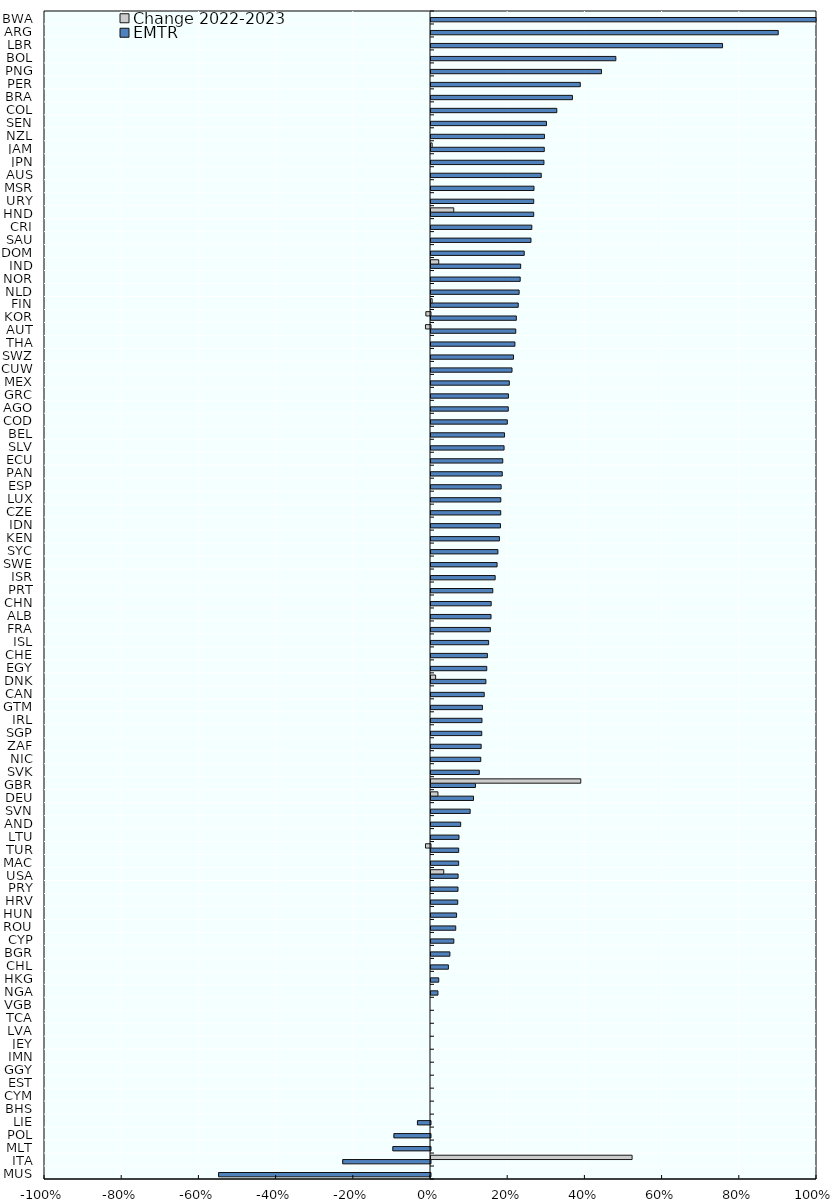
| Category | EMTR | Change 2022-2023 |
|---|---|---|
| MUS | -0.549 | 0 |
| ITA | -0.227 | 0.521 |
| MLT | -0.097 | 0 |
| POL | -0.095 | 0 |
| LIE | -0.034 | 0 |
| BHS | 0 | 0 |
| CYM | 0 | 0 |
| EST | 0 | 0 |
| GGY | 0 | 0 |
| IMN | 0 | 0 |
| JEY | 0 | 0 |
| LVA | 0 | 0 |
| TCA | 0 | 0 |
| VGB | 0 | 0 |
| NGA | 0.018 | 0 |
| HKG | 0.02 | 0 |
| CHL | 0.045 | 0 |
| BGR | 0.049 | 0 |
| CYP | 0.059 | 0 |
| ROU | 0.064 | 0 |
| HUN | 0.066 | 0 |
| HRV | 0.069 | 0 |
| PRY | 0.07 | 0 |
| USA | 0.07 | 0.033 |
| MAC | 0.072 | 0 |
| TUR | 0.072 | -0.013 |
| LTU | 0.073 | 0 |
| AND | 0.077 | 0 |
| SVN | 0.101 | 0 |
| DEU | 0.11 | 0.018 |
| GBR | 0.115 | 0.388 |
| SVK | 0.125 | 0 |
| NIC | 0.129 | 0 |
| ZAF | 0.13 | 0 |
| SGP | 0.131 | 0 |
| IRL | 0.132 | 0 |
| GTM | 0.133 | 0 |
| CAN | 0.138 | 0 |
| DNK | 0.142 | 0.012 |
| EGY | 0.144 | 0 |
| CHE | 0.146 | 0 |
| ISL | 0.149 | 0 |
| FRA | 0.154 | 0 |
| ALB | 0.155 | 0 |
| CHN | 0.156 | 0 |
| PRT | 0.16 | 0 |
| ISR | 0.166 | 0 |
| SWE | 0.171 | 0 |
| SYC | 0.173 | 0 |
| KEN | 0.177 | 0 |
| IDN | 0.18 | 0 |
| CZE | 0.181 | 0 |
| LUX | 0.181 | 0 |
| ESP | 0.182 | 0 |
| PAN | 0.185 | 0 |
| ECU | 0.186 | 0 |
| SLV | 0.189 | 0 |
| BEL | 0.19 | 0 |
| COD | 0.198 | 0 |
| AGO | 0.2 | 0 |
| GRC | 0.201 | 0 |
| MEX | 0.203 | 0 |
| CUW | 0.21 | 0 |
| SWZ | 0.214 | 0 |
| THA | 0.217 | 0 |
| AUT | 0.22 | -0.013 |
| KOR | 0.221 | -0.012 |
| FIN | 0.226 | 0.003 |
| NLD | 0.228 | 0 |
| NOR | 0.231 | 0 |
| IND | 0.232 | 0.02 |
| DOM | 0.242 | 0 |
| SAU | 0.259 | 0 |
| CRI | 0.261 | 0 |
| HND | 0.266 | 0.059 |
| URY | 0.266 | 0 |
| MSR | 0.267 | 0 |
| AUS | 0.286 | 0 |
| JPN | 0.293 | 0 |
| JAM | 0.293 | 0.003 |
| NZL | 0.294 | 0 |
| SEN | 0.299 | 0 |
| COL | 0.326 | 0 |
| BRA | 0.366 | 0 |
| PER | 0.387 | 0 |
| PNG | 0.442 | 0 |
| BOL | 0.479 | 0 |
| LBR | 0.755 | 0 |
| ARG | 0.9 | 0 |
| BWA | 1.079 | 0 |